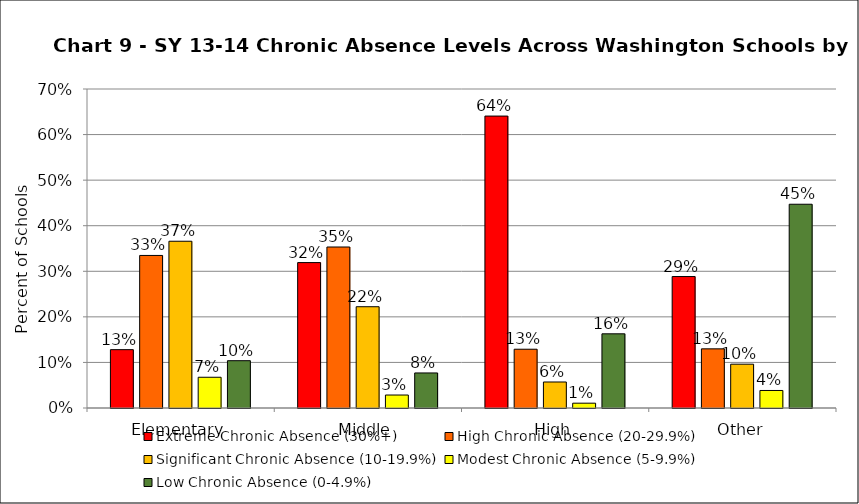
| Category | Extreme Chronic Absence (30%+) | High Chronic Absence (20-29.9%) | Significant Chronic Absence (10-19.9%) | Modest Chronic Absence (5-9.9%) | Low Chronic Absence (0-4.9%) |
|---|---|---|---|---|---|
| 0 | 0.128 | 0.335 | 0.366 | 0.067 | 0.104 |
| 1 | 0.319 | 0.353 | 0.222 | 0.028 | 0.077 |
| 2 | 0.641 | 0.129 | 0.057 | 0.011 | 0.163 |
| 3 | 0.288 | 0.13 | 0.096 | 0.038 | 0.447 |